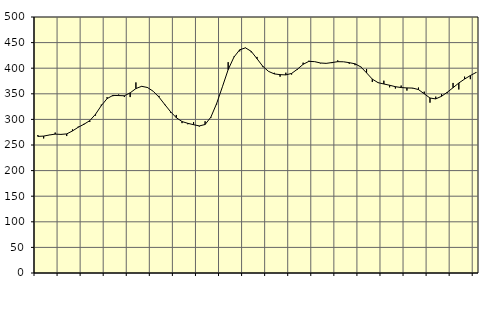
| Category | Piggar | Series 1 |
|---|---|---|
| nan | 269.5 | 266.78 |
| 1.0 | 262.8 | 267.42 |
| 1.0 | 269.8 | 269.55 |
| 1.0 | 274.3 | 271.25 |
| nan | 270.4 | 270.71 |
| 2.0 | 267.5 | 271.68 |
| 2.0 | 280.4 | 277.41 |
| 2.0 | 285.9 | 284.68 |
| nan | 291.4 | 290.55 |
| 3.0 | 294.9 | 297.56 |
| 3.0 | 307.5 | 310.14 |
| 3.0 | 328.8 | 326.82 |
| nan | 343.5 | 340.56 |
| 4.0 | 345.3 | 346.85 |
| 4.0 | 348.6 | 346.57 |
| 4.0 | 343.7 | 346.14 |
| nan | 343.6 | 351.82 |
| 5.0 | 372.2 | 360.26 |
| 5.0 | 364.1 | 364.64 |
| 5.0 | 361.4 | 362.33 |
| nan | 354.9 | 354.96 |
| 6.0 | 346 | 343.56 |
| 6.0 | 328 | 329.16 |
| 6.0 | 313.3 | 315.14 |
| nan | 308.7 | 303.35 |
| 7.0 | 292.7 | 295.8 |
| 7.0 | 290.5 | 292.33 |
| 7.0 | 294.7 | 289.65 |
| nan | 286.2 | 287.25 |
| 8.0 | 296.4 | 290.03 |
| 8.0 | 303.2 | 304.44 |
| 8.0 | 329.2 | 330.92 |
| nan | 363.7 | 363.66 |
| 9.0 | 411.8 | 397.23 |
| 9.0 | 422.6 | 421.59 |
| 9.0 | 433 | 435.95 |
| nan | 439.4 | 439.77 |
| 10.0 | 431 | 432.9 |
| 10.0 | 422 | 418.53 |
| 10.0 | 402.2 | 403.74 |
| nan | 393.5 | 393.75 |
| 11.0 | 391 | 388.88 |
| 11.0 | 383.4 | 387.4 |
| 11.0 | 391.2 | 386.91 |
| nan | 387.6 | 389.8 |
| 12.0 | 396.9 | 397.97 |
| 12.0 | 410.8 | 407.58 |
| 12.0 | 414.6 | 413.34 |
| nan | 412.9 | 412.8 |
| 13.0 | 409.5 | 410.16 |
| 13.0 | 409.1 | 409.45 |
| 13.0 | 410 | 411.03 |
| nan | 415.2 | 412.73 |
| 14.0 | 412.5 | 412.51 |
| 14.0 | 408.6 | 410.8 |
| 14.0 | 405.9 | 408.58 |
| nan | 403.1 | 402.56 |
| 15.0 | 398.5 | 390.91 |
| 15.0 | 373 | 378.66 |
| 15.0 | 371.1 | 371.75 |
| nan | 375.6 | 369.15 |
| 16.0 | 362.7 | 366.72 |
| 16.0 | 360.3 | 363.91 |
| 16.0 | 366.1 | 362.21 |
| nan | 356.3 | 361.48 |
| 17.0 | 360.5 | 361.17 |
| 17.0 | 362.2 | 358.26 |
| 17.0 | 354.2 | 350.04 |
| nan | 332.7 | 341.76 |
| 18.0 | 344.5 | 340.01 |
| 18.0 | 349.6 | 345.13 |
| 18.0 | 351.2 | 353.05 |
| nan | 371.2 | 361.91 |
| 19.0 | 358.4 | 371.09 |
| 19.0 | 383.5 | 378.77 |
| 19.0 | 378.6 | 385.67 |
| nan | 392.6 | 391.69 |